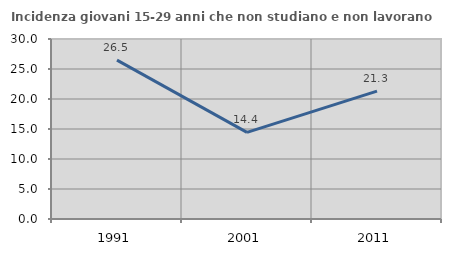
| Category | Incidenza giovani 15-29 anni che non studiano e non lavorano  |
|---|---|
| 1991.0 | 26.486 |
| 2001.0 | 14.433 |
| 2011.0 | 21.311 |